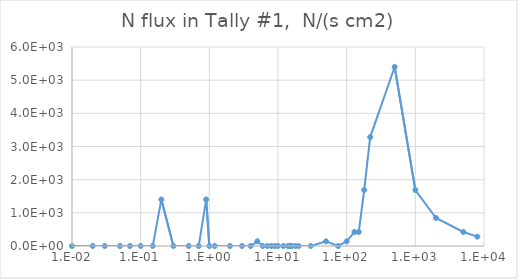
| Category | Series 0 |
|---|---|
| 1e-09 | 0 |
| 1e-08 | 0 |
| 2.5e-08 | 0 |
| 1e-07 | 0 |
| 2e-07 | 0 |
| 5e-07 | 0 |
| 1e-06 | 0 |
| 2e-06 | 0 |
| 5e-06 | 0 |
| 1e-05 | 0 |
| 2e-05 | 0 |
| 5e-05 | 0 |
| 0.0001 | 0 |
| 0.0002 | 0 |
| 0.0005 | 0 |
| 0.001 | 0 |
| 0.002 | 0 |
| 0.005 | 0 |
| 0.01 | 0 |
| 0.02 | 0 |
| 0.03 | 0 |
| 0.05 | 0 |
| 0.07 | 0 |
| 0.1 | 0 |
| 0.15 | 0 |
| 0.2 | 1400.73 |
| 0.3 | 0 |
| 0.5 | 0 |
| 0.7 | 0 |
| 0.9 | 1403.95 |
| 1.0 | 0 |
| 1.2 | 0 |
| 2.0 | 0 |
| 3.0 | 0 |
| 4.0 | 0 |
| 5.0 | 140.714 |
| 6.0 | 0 |
| 7.0 | 0 |
| 8.0 | 0 |
| 9.0 | 0 |
| 10.0 | 0 |
| 12.0 | 0 |
| 14.0 | 0 |
| 15.0 | 0 |
| 16.0 | 0 |
| 18.0 | 0 |
| 20.0 | 0 |
| 30.0 | 0 |
| 50.0 | 140.711 |
| 75.0 | 0 |
| 100.0 | 140.711 |
| 130.0 | 422.133 |
| 150.0 | 422.133 |
| 180.0 | 1688.53 |
| 220.0 | 3284.96 |
| 500.0 | 5398.04 |
| 1000.0 | 1688.8 |
| 2000.0 | 844.263 |
| 5000.0 | 422.132 |
| 8000.0 | 281.421 |